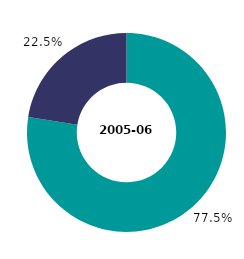
| Category | 2005-06 |
|---|---|
| households without dependent children | 77.5 |
| households with dependent children | 22.5 |